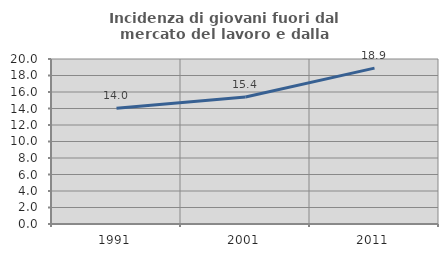
| Category | Incidenza di giovani fuori dal mercato del lavoro e dalla formazione  |
|---|---|
| 1991.0 | 14.019 |
| 2001.0 | 15.385 |
| 2011.0 | 18.898 |